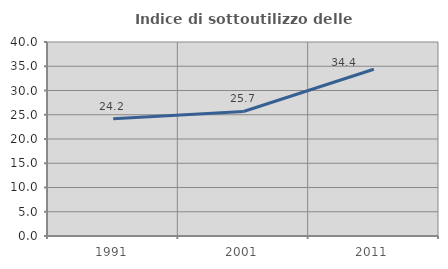
| Category | Indice di sottoutilizzo delle abitazioni  |
|---|---|
| 1991.0 | 24.196 |
| 2001.0 | 25.677 |
| 2011.0 | 34.375 |